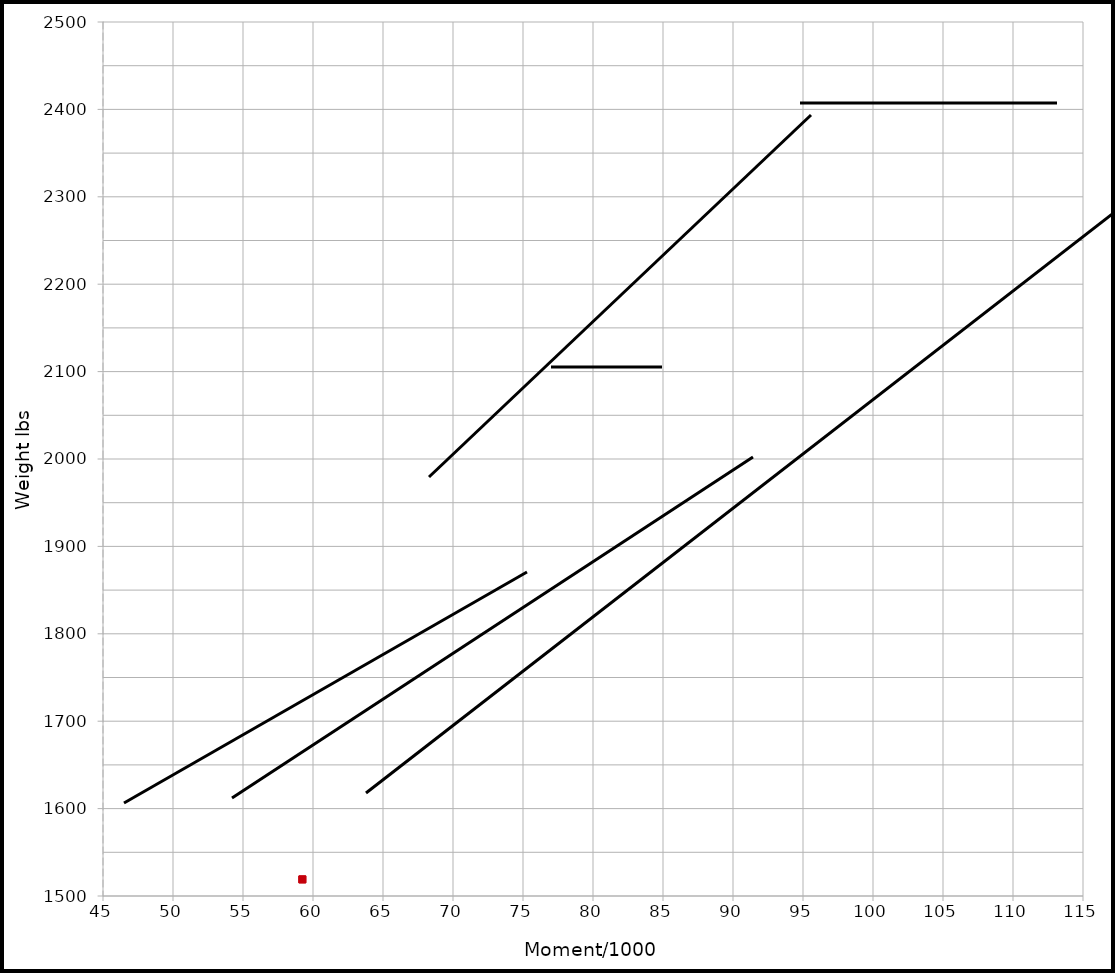
| Category | Series 0 |
|---|---|
| 59.23904 | 1519 |
| 59.23904 | 1519 |